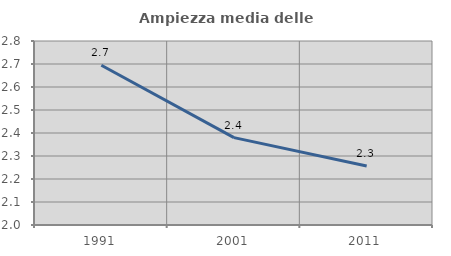
| Category | Ampiezza media delle famiglie |
|---|---|
| 1991.0 | 2.694 |
| 2001.0 | 2.38 |
| 2011.0 | 2.256 |